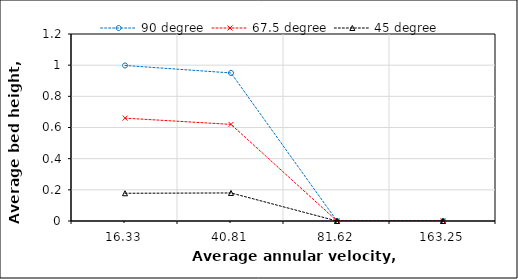
| Category | 90 degree | 67.5 degree | 45 degree |
|---|---|---|---|
| 16.33 | 0.998 | 0.66 | 0.178 |
| 40.81 | 0.95 | 0.62 | 0.18 |
| 81.62 | 0 | 0 | 0 |
| 163.25 | 0 | 0 | 0 |